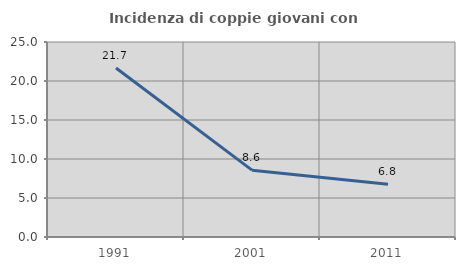
| Category | Incidenza di coppie giovani con figli |
|---|---|
| 1991.0 | 21.667 |
| 2001.0 | 8.571 |
| 2011.0 | 6.757 |